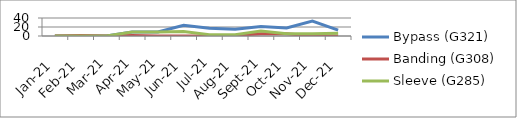
| Category | Bypass (G321) | Banding (G308) | Sleeve (G285) |
|---|---|---|---|
| 2021-01-01 | 0 | 0 | 0 |
| 2021-02-01 | 0 | 1 | 0 |
| 2021-03-01 | 0 | 0 | 0 |
| 2021-04-01 | 9 | 1 | 9 |
| 2021-05-01 | 9 | 0 | 9 |
| 2021-06-01 | 24 | 0 | 10 |
| 2021-07-01 | 17 | 0 | 3 |
| 2021-08-01 | 15 | 1 | 3 |
| 2021-09-01 | 21 | 5 | 11 |
| 2021-10-01 | 18 | 5 | 5 |
| 2021-11-01 | 33 | 0 | 5 |
| 2021-12-01 | 13 | 0 | 6 |